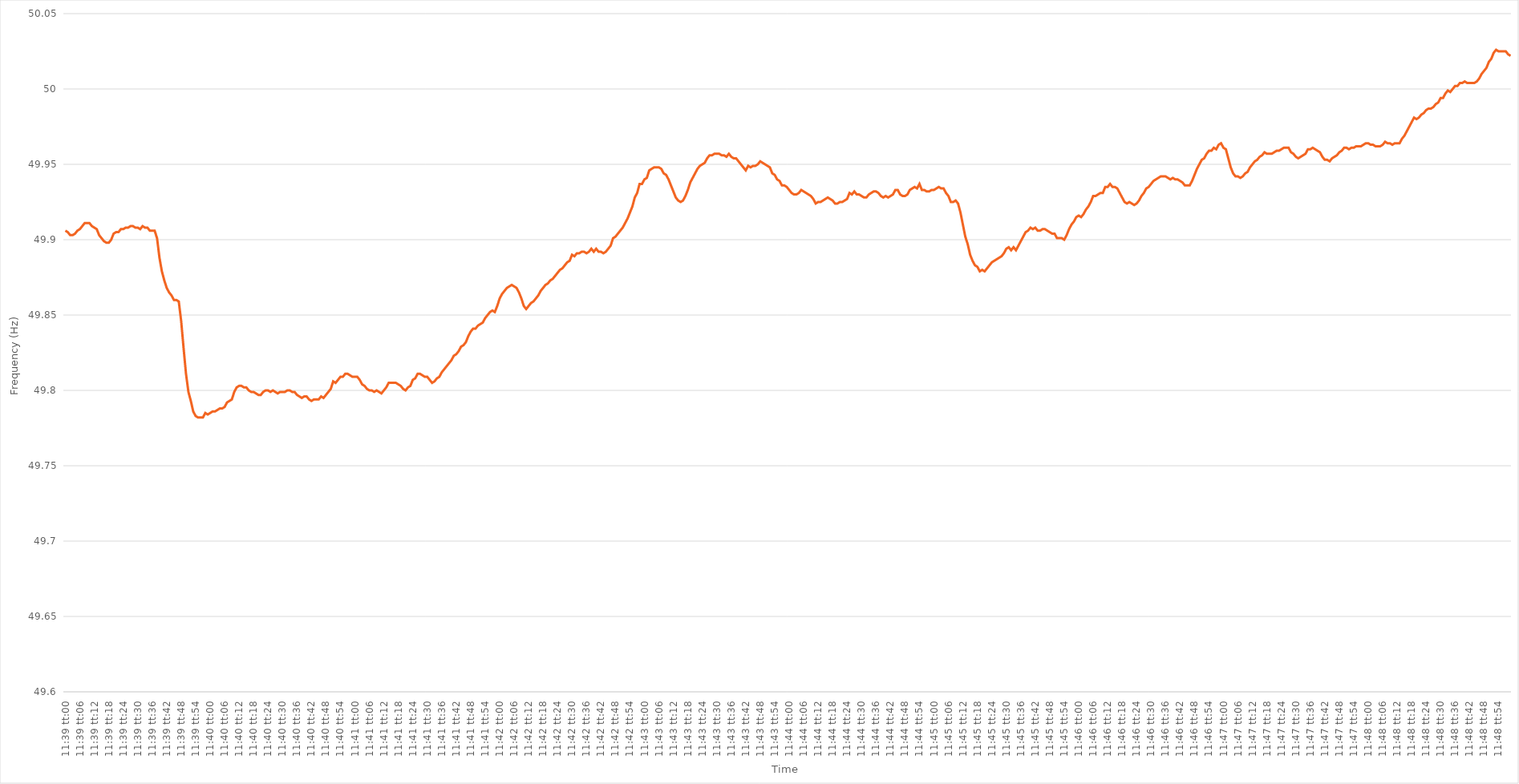
| Category | Series 0 |
|---|---|
| 0.48541666666666666 | 49.906 |
| 0.4854282407407407 | 49.905 |
| 0.48543981481481485 | 49.903 |
| 0.4854513888888889 | 49.903 |
| 0.485462962962963 | 49.904 |
| 0.485474537037037 | 49.906 |
| 0.4854861111111111 | 49.907 |
| 0.48549768518518516 | 49.909 |
| 0.4855092592592593 | 49.911 |
| 0.48552083333333335 | 49.911 |
| 0.48553240740740744 | 49.911 |
| 0.4855439814814815 | 49.909 |
| 0.4855555555555556 | 49.908 |
| 0.4855671296296296 | 49.907 |
| 0.48557870370370365 | 49.903 |
| 0.4855902777777778 | 49.901 |
| 0.48560185185185184 | 49.899 |
| 0.48561342592592593 | 49.898 |
| 0.485625 | 49.898 |
| 0.48563657407407407 | 49.9 |
| 0.4856481481481481 | 49.904 |
| 0.48565972222222226 | 49.905 |
| 0.4856712962962963 | 49.905 |
| 0.4856828703703704 | 49.907 |
| 0.48569444444444443 | 49.907 |
| 0.4857060185185185 | 49.908 |
| 0.48571759259259256 | 49.908 |
| 0.4857291666666667 | 49.909 |
| 0.48574074074074075 | 49.909 |
| 0.48575231481481485 | 49.908 |
| 0.4857638888888889 | 49.908 |
| 0.485775462962963 | 49.907 |
| 0.485787037037037 | 49.909 |
| 0.48579861111111106 | 49.908 |
| 0.4858101851851852 | 49.908 |
| 0.48582175925925924 | 49.906 |
| 0.48583333333333334 | 49.906 |
| 0.4858449074074074 | 49.906 |
| 0.4858564814814815 | 49.901 |
| 0.4858680555555555 | 49.888 |
| 0.48587962962962966 | 49.879 |
| 0.4858912037037037 | 49.873 |
| 0.4859027777777778 | 49.868 |
| 0.48591435185185183 | 49.865 |
| 0.48592592592592593 | 49.863 |
| 0.48593749999999997 | 49.86 |
| 0.4859490740740741 | 49.86 |
| 0.48596064814814816 | 49.859 |
| 0.48597222222222225 | 49.846 |
| 0.4859837962962963 | 49.828 |
| 0.4859953703703704 | 49.811 |
| 0.4860069444444444 | 49.799 |
| 0.48601851851851857 | 49.793 |
| 0.4860300925925926 | 49.786 |
| 0.48604166666666665 | 49.783 |
| 0.48605324074074074 | 49.782 |
| 0.4860648148148148 | 49.782 |
| 0.4860763888888889 | 49.782 |
| 0.4860879629629629 | 49.785 |
| 0.48609953703703707 | 49.784 |
| 0.4861111111111111 | 49.785 |
| 0.4861226851851852 | 49.786 |
| 0.48613425925925924 | 49.786 |
| 0.48614583333333333 | 49.787 |
| 0.48615740740740737 | 49.788 |
| 0.4861689814814815 | 49.788 |
| 0.48618055555555556 | 49.789 |
| 0.48619212962962965 | 49.792 |
| 0.4862037037037037 | 49.793 |
| 0.4862152777777778 | 49.794 |
| 0.4862268518518518 | 49.799 |
| 0.486238425925926 | 49.802 |
| 0.48625 | 49.803 |
| 0.4862615740740741 | 49.803 |
| 0.48627314814814815 | 49.802 |
| 0.4862847222222222 | 49.802 |
| 0.4862962962962963 | 49.8 |
| 0.4863078703703703 | 49.799 |
| 0.48631944444444447 | 49.799 |
| 0.4863310185185185 | 49.798 |
| 0.4863425925925926 | 49.797 |
| 0.48635416666666664 | 49.797 |
| 0.48636574074074074 | 49.799 |
| 0.4863773148148148 | 49.8 |
| 0.4863888888888889 | 49.8 |
| 0.48640046296296297 | 49.799 |
| 0.48641203703703706 | 49.8 |
| 0.4864236111111111 | 49.799 |
| 0.4864351851851852 | 49.798 |
| 0.48644675925925923 | 49.799 |
| 0.4864583333333334 | 49.799 |
| 0.4864699074074074 | 49.799 |
| 0.4864814814814815 | 49.8 |
| 0.48649305555555555 | 49.8 |
| 0.48650462962962965 | 49.799 |
| 0.4865162037037037 | 49.799 |
| 0.4865277777777777 | 49.797 |
| 0.4865393518518519 | 49.796 |
| 0.4865509259259259 | 49.795 |
| 0.4865625 | 49.796 |
| 0.48657407407407405 | 49.796 |
| 0.48658564814814814 | 49.794 |
| 0.4865972222222222 | 49.793 |
| 0.48660879629629633 | 49.794 |
| 0.48662037037037037 | 49.794 |
| 0.48663194444444446 | 49.794 |
| 0.4866435185185185 | 49.796 |
| 0.4866550925925926 | 49.795 |
| 0.48666666666666664 | 49.797 |
| 0.4866782407407408 | 49.799 |
| 0.4866898148148148 | 49.801 |
| 0.4867013888888889 | 49.806 |
| 0.48671296296296296 | 49.805 |
| 0.48672453703703705 | 49.807 |
| 0.4867361111111111 | 49.809 |
| 0.48674768518518513 | 49.809 |
| 0.4867592592592593 | 49.811 |
| 0.4867708333333333 | 49.811 |
| 0.4867824074074074 | 49.81 |
| 0.48679398148148145 | 49.809 |
| 0.48680555555555555 | 49.809 |
| 0.4868171296296296 | 49.809 |
| 0.48682870370370374 | 49.807 |
| 0.4868402777777778 | 49.804 |
| 0.48685185185185187 | 49.803 |
| 0.4868634259259259 | 49.801 |
| 0.486875 | 49.8 |
| 0.48688657407407404 | 49.8 |
| 0.4868981481481482 | 49.799 |
| 0.48690972222222223 | 49.8 |
| 0.4869212962962963 | 49.799 |
| 0.48693287037037036 | 49.798 |
| 0.48694444444444446 | 49.8 |
| 0.4869560185185185 | 49.802 |
| 0.48696759259259265 | 49.805 |
| 0.4869791666666667 | 49.805 |
| 0.4869907407407407 | 49.805 |
| 0.4870023148148148 | 49.805 |
| 0.48701388888888886 | 49.804 |
| 0.48702546296296295 | 49.803 |
| 0.487037037037037 | 49.801 |
| 0.48704861111111114 | 49.8 |
| 0.4870601851851852 | 49.802 |
| 0.4870717592592593 | 49.803 |
| 0.4870833333333333 | 49.807 |
| 0.4870949074074074 | 49.808 |
| 0.48710648148148145 | 49.811 |
| 0.4871180555555556 | 49.811 |
| 0.48712962962962963 | 49.81 |
| 0.48714120370370373 | 49.809 |
| 0.48715277777777777 | 49.809 |
| 0.48716435185185186 | 49.807 |
| 0.4871759259259259 | 49.805 |
| 0.48718750000000005 | 49.806 |
| 0.4871990740740741 | 49.808 |
| 0.4872106481481482 | 49.809 |
| 0.4872222222222222 | 49.812 |
| 0.48723379629629626 | 49.814 |
| 0.48724537037037036 | 49.816 |
| 0.4872569444444444 | 49.818 |
| 0.48726851851851855 | 49.82 |
| 0.4872800925925926 | 49.823 |
| 0.4872916666666667 | 49.824 |
| 0.4873032407407407 | 49.826 |
| 0.4873148148148148 | 49.829 |
| 0.48732638888888885 | 49.83 |
| 0.487337962962963 | 49.832 |
| 0.48734953703703704 | 49.836 |
| 0.48736111111111113 | 49.839 |
| 0.4873726851851852 | 49.841 |
| 0.48738425925925927 | 49.841 |
| 0.4873958333333333 | 49.843 |
| 0.48740740740740746 | 49.844 |
| 0.4874189814814815 | 49.845 |
| 0.4874305555555556 | 49.848 |
| 0.48744212962962963 | 49.85 |
| 0.48745370370370367 | 49.852 |
| 0.48746527777777776 | 49.853 |
| 0.4874768518518518 | 49.852 |
| 0.48748842592592595 | 49.856 |
| 0.4875 | 49.861 |
| 0.4875115740740741 | 49.864 |
| 0.4875231481481481 | 49.866 |
| 0.4875347222222222 | 49.868 |
| 0.48754629629629626 | 49.869 |
| 0.4875578703703704 | 49.87 |
| 0.48756944444444444 | 49.869 |
| 0.48758101851851854 | 49.868 |
| 0.4875925925925926 | 49.865 |
| 0.48760416666666667 | 49.861 |
| 0.4876157407407407 | 49.856 |
| 0.48762731481481486 | 49.854 |
| 0.4876388888888889 | 49.856 |
| 0.487650462962963 | 49.858 |
| 0.48766203703703703 | 49.859 |
| 0.4876736111111111 | 49.861 |
| 0.48768518518518517 | 49.863 |
| 0.4876967592592592 | 49.866 |
| 0.48770833333333335 | 49.868 |
| 0.4877199074074074 | 49.87 |
| 0.4877314814814815 | 49.871 |
| 0.4877430555555555 | 49.873 |
| 0.4877546296296296 | 49.874 |
| 0.48776620370370366 | 49.876 |
| 0.4877777777777778 | 49.878 |
| 0.48778935185185185 | 49.88 |
| 0.48780092592592594 | 49.881 |
| 0.4878125 | 49.883 |
| 0.4878240740740741 | 49.885 |
| 0.4878356481481481 | 49.886 |
| 0.48784722222222227 | 49.89 |
| 0.4878587962962963 | 49.889 |
| 0.4878703703703704 | 49.891 |
| 0.48788194444444444 | 49.891 |
| 0.48789351851851853 | 49.892 |
| 0.48790509259259257 | 49.892 |
| 0.4879166666666667 | 49.891 |
| 0.48792824074074076 | 49.892 |
| 0.4879398148148148 | 49.894 |
| 0.4879513888888889 | 49.892 |
| 0.48796296296296293 | 49.894 |
| 0.487974537037037 | 49.892 |
| 0.48798611111111106 | 49.892 |
| 0.4879976851851852 | 49.891 |
| 0.48800925925925925 | 49.892 |
| 0.48802083333333335 | 49.894 |
| 0.4880324074074074 | 49.896 |
| 0.4880439814814815 | 49.901 |
| 0.4880555555555555 | 49.902 |
| 0.48806712962962967 | 49.904 |
| 0.4880787037037037 | 49.906 |
| 0.4880902777777778 | 49.908 |
| 0.48810185185185184 | 49.911 |
| 0.48811342592592594 | 49.914 |
| 0.488125 | 49.918 |
| 0.4881365740740741 | 49.922 |
| 0.48814814814814816 | 49.928 |
| 0.48815972222222226 | 49.931 |
| 0.4881712962962963 | 49.937 |
| 0.48818287037037034 | 49.937 |
| 0.48819444444444443 | 49.94 |
| 0.48820601851851847 | 49.941 |
| 0.4882175925925926 | 49.946 |
| 0.48822916666666666 | 49.947 |
| 0.48824074074074075 | 49.948 |
| 0.4882523148148148 | 49.948 |
| 0.4882638888888889 | 49.948 |
| 0.4882754629629629 | 49.947 |
| 0.4882870370370371 | 49.944 |
| 0.4882986111111111 | 49.943 |
| 0.4883101851851852 | 49.94 |
| 0.48832175925925925 | 49.936 |
| 0.48833333333333334 | 49.932 |
| 0.4883449074074074 | 49.928 |
| 0.48835648148148153 | 49.926 |
| 0.48836805555555557 | 49.925 |
| 0.48837962962962966 | 49.926 |
| 0.4883912037037037 | 49.929 |
| 0.48840277777777774 | 49.933 |
| 0.48841435185185184 | 49.938 |
| 0.4884259259259259 | 49.941 |
| 0.4884375 | 49.944 |
| 0.48844907407407406 | 49.947 |
| 0.48846064814814816 | 49.949 |
| 0.4884722222222222 | 49.95 |
| 0.4884837962962963 | 49.951 |
| 0.48849537037037033 | 49.954 |
| 0.4885069444444445 | 49.956 |
| 0.4885185185185185 | 49.956 |
| 0.4885300925925926 | 49.957 |
| 0.48854166666666665 | 49.957 |
| 0.48855324074074075 | 49.957 |
| 0.4885648148148148 | 49.956 |
| 0.48857638888888894 | 49.956 |
| 0.488587962962963 | 49.955 |
| 0.48859953703703707 | 49.957 |
| 0.4886111111111111 | 49.955 |
| 0.4886226851851852 | 49.954 |
| 0.48863425925925924 | 49.954 |
| 0.4886458333333333 | 49.952 |
| 0.48865740740740743 | 49.95 |
| 0.48866898148148147 | 49.948 |
| 0.48868055555555556 | 49.946 |
| 0.4886921296296296 | 49.949 |
| 0.4887037037037037 | 49.948 |
| 0.48871527777777773 | 49.949 |
| 0.4887268518518519 | 49.949 |
| 0.4887384259259259 | 49.95 |
| 0.48875 | 49.952 |
| 0.48876157407407406 | 49.951 |
| 0.48877314814814815 | 49.95 |
| 0.4887847222222222 | 49.949 |
| 0.48879629629629634 | 49.948 |
| 0.4888078703703704 | 49.944 |
| 0.4888194444444445 | 49.943 |
| 0.4888310185185185 | 49.94 |
| 0.4888425925925926 | 49.939 |
| 0.48885416666666665 | 49.936 |
| 0.4888657407407408 | 49.936 |
| 0.48887731481481483 | 49.935 |
| 0.4888888888888889 | 49.933 |
| 0.48890046296296297 | 49.931 |
| 0.488912037037037 | 49.93 |
| 0.4889236111111111 | 49.93 |
| 0.48893518518518514 | 49.931 |
| 0.4889467592592593 | 49.933 |
| 0.48895833333333333 | 49.932 |
| 0.4889699074074074 | 49.931 |
| 0.48898148148148146 | 49.93 |
| 0.48899305555555556 | 49.929 |
| 0.4890046296296296 | 49.927 |
| 0.48901620370370374 | 49.924 |
| 0.4890277777777778 | 49.925 |
| 0.4890393518518519 | 49.925 |
| 0.4890509259259259 | 49.926 |
| 0.4890625 | 49.927 |
| 0.48907407407407405 | 49.928 |
| 0.4890856481481482 | 49.927 |
| 0.48909722222222224 | 49.926 |
| 0.48910879629629633 | 49.924 |
| 0.48912037037037037 | 49.924 |
| 0.4891319444444444 | 49.925 |
| 0.4891435185185185 | 49.925 |
| 0.48915509259259254 | 49.926 |
| 0.4891666666666667 | 49.927 |
| 0.48917824074074073 | 49.931 |
| 0.4891898148148148 | 49.93 |
| 0.48920138888888887 | 49.932 |
| 0.48921296296296296 | 49.93 |
| 0.489224537037037 | 49.93 |
| 0.48923611111111115 | 49.929 |
| 0.4892476851851852 | 49.928 |
| 0.4892592592592593 | 49.928 |
| 0.4892708333333333 | 49.93 |
| 0.4892824074074074 | 49.931 |
| 0.48929398148148145 | 49.932 |
| 0.4893055555555556 | 49.932 |
| 0.48931712962962964 | 49.931 |
| 0.48932870370370374 | 49.929 |
| 0.4893402777777778 | 49.928 |
| 0.4893518518518518 | 49.929 |
| 0.4893634259259259 | 49.928 |
| 0.48937499999999995 | 49.929 |
| 0.4893865740740741 | 49.93 |
| 0.48939814814814814 | 49.933 |
| 0.48940972222222223 | 49.933 |
| 0.48942129629629627 | 49.93 |
| 0.48943287037037037 | 49.929 |
| 0.4894444444444444 | 49.929 |
| 0.48945601851851855 | 49.93 |
| 0.4894675925925926 | 49.933 |
| 0.4894791666666667 | 49.934 |
| 0.4894907407407407 | 49.935 |
| 0.4895023148148148 | 49.934 |
| 0.48951388888888886 | 49.937 |
| 0.489525462962963 | 49.933 |
| 0.48953703703703705 | 49.933 |
| 0.48954861111111114 | 49.932 |
| 0.4895601851851852 | 49.932 |
| 0.4895717592592593 | 49.933 |
| 0.4895833333333333 | 49.933 |
| 0.48959490740740735 | 49.934 |
| 0.4896064814814815 | 49.935 |
| 0.48961805555555554 | 49.934 |
| 0.48962962962962964 | 49.934 |
| 0.4896412037037037 | 49.931 |
| 0.48965277777777777 | 49.929 |
| 0.4896643518518518 | 49.925 |
| 0.48967592592592596 | 49.925 |
| 0.4896875 | 49.926 |
| 0.4896990740740741 | 49.924 |
| 0.48971064814814813 | 49.918 |
| 0.4897222222222222 | 49.91 |
| 0.48973379629629626 | 49.902 |
| 0.4897453703703704 | 49.897 |
| 0.48975694444444445 | 49.89 |
| 0.48976851851851855 | 49.886 |
| 0.4897800925925926 | 49.883 |
| 0.4897916666666667 | 49.882 |
| 0.4898032407407407 | 49.879 |
| 0.48981481481481487 | 49.88 |
| 0.4898263888888889 | 49.879 |
| 0.48983796296296295 | 49.881 |
| 0.48984953703703704 | 49.883 |
| 0.4898611111111111 | 49.885 |
| 0.4898726851851852 | 49.886 |
| 0.4898842592592592 | 49.887 |
| 0.48989583333333336 | 49.888 |
| 0.4899074074074074 | 49.889 |
| 0.4899189814814815 | 49.891 |
| 0.48993055555555554 | 49.894 |
| 0.48994212962962963 | 49.895 |
| 0.48995370370370367 | 49.893 |
| 0.4899652777777778 | 49.895 |
| 0.48997685185185186 | 49.893 |
| 0.48998842592592595 | 49.896 |
| 0.49 | 49.899 |
| 0.4900115740740741 | 49.902 |
| 0.4900231481481481 | 49.905 |
| 0.4900347222222223 | 49.906 |
| 0.4900462962962963 | 49.908 |
| 0.49005787037037035 | 49.907 |
| 0.49006944444444445 | 49.908 |
| 0.4900810185185185 | 49.906 |
| 0.4900925925925926 | 49.906 |
| 0.4901041666666666 | 49.907 |
| 0.49011574074074077 | 49.907 |
| 0.4901273148148148 | 49.906 |
| 0.4901388888888889 | 49.905 |
| 0.49015046296296294 | 49.904 |
| 0.49016203703703703 | 49.904 |
| 0.4901736111111111 | 49.901 |
| 0.4901851851851852 | 49.901 |
| 0.49019675925925926 | 49.901 |
| 0.49020833333333336 | 49.9 |
| 0.4902199074074074 | 49.903 |
| 0.4902314814814815 | 49.907 |
| 0.49024305555555553 | 49.91 |
| 0.4902546296296297 | 49.912 |
| 0.4902662037037037 | 49.915 |
| 0.4902777777777778 | 49.916 |
| 0.49028935185185185 | 49.915 |
| 0.4903009259259259 | 49.917 |
| 0.4903125 | 49.92 |
| 0.490324074074074 | 49.922 |
| 0.4903356481481482 | 49.925 |
| 0.4903472222222222 | 49.929 |
| 0.4903587962962963 | 49.929 |
| 0.49037037037037035 | 49.93 |
| 0.49038194444444444 | 49.931 |
| 0.4903935185185185 | 49.931 |
| 0.49040509259259263 | 49.935 |
| 0.49041666666666667 | 49.935 |
| 0.49042824074074076 | 49.937 |
| 0.4904398148148148 | 49.935 |
| 0.4904513888888889 | 49.935 |
| 0.49046296296296293 | 49.934 |
| 0.4904745370370371 | 49.931 |
| 0.4904861111111111 | 49.928 |
| 0.4904976851851852 | 49.925 |
| 0.49050925925925926 | 49.924 |
| 0.49052083333333335 | 49.925 |
| 0.4905324074074074 | 49.924 |
| 0.49054398148148143 | 49.923 |
| 0.4905555555555556 | 49.924 |
| 0.4905671296296296 | 49.926 |
| 0.4905787037037037 | 49.929 |
| 0.49059027777777775 | 49.931 |
| 0.49060185185185184 | 49.934 |
| 0.4906134259259259 | 49.935 |
| 0.49062500000000003 | 49.937 |
| 0.49063657407407407 | 49.939 |
| 0.49064814814814817 | 49.94 |
| 0.4906597222222222 | 49.941 |
| 0.4906712962962963 | 49.942 |
| 0.49068287037037034 | 49.942 |
| 0.4906944444444445 | 49.942 |
| 0.4907060185185185 | 49.941 |
| 0.4907175925925926 | 49.94 |
| 0.49072916666666666 | 49.941 |
| 0.49074074074074076 | 49.94 |
| 0.4907523148148148 | 49.94 |
| 0.49076388888888894 | 49.939 |
| 0.490775462962963 | 49.938 |
| 0.490787037037037 | 49.936 |
| 0.4907986111111111 | 49.936 |
| 0.49081018518518515 | 49.936 |
| 0.49082175925925925 | 49.939 |
| 0.4908333333333333 | 49.943 |
| 0.49084490740740744 | 49.947 |
| 0.4908564814814815 | 49.95 |
| 0.49086805555555557 | 49.953 |
| 0.4908796296296296 | 49.954 |
| 0.4908912037037037 | 49.957 |
| 0.49090277777777774 | 49.959 |
| 0.4909143518518519 | 49.959 |
| 0.49092592592592593 | 49.961 |
| 0.4909375 | 49.96 |
| 0.49094907407407407 | 49.963 |
| 0.49096064814814816 | 49.964 |
| 0.4909722222222222 | 49.961 |
| 0.49098379629629635 | 49.96 |
| 0.4909953703703704 | 49.954 |
| 0.4910069444444444 | 49.948 |
| 0.4910185185185185 | 49.944 |
| 0.49103009259259256 | 49.942 |
| 0.49104166666666665 | 49.942 |
| 0.4910532407407407 | 49.941 |
| 0.49106481481481484 | 49.942 |
| 0.4910763888888889 | 49.944 |
| 0.491087962962963 | 49.945 |
| 0.491099537037037 | 49.948 |
| 0.4911111111111111 | 49.95 |
| 0.49112268518518515 | 49.952 |
| 0.4911342592592593 | 49.953 |
| 0.49114583333333334 | 49.955 |
| 0.49115740740740743 | 49.956 |
| 0.49116898148148147 | 49.958 |
| 0.49118055555555556 | 49.957 |
| 0.4911921296296296 | 49.957 |
| 0.49120370370370375 | 49.957 |
| 0.4912152777777778 | 49.958 |
| 0.4912268518518519 | 49.959 |
| 0.4912384259259259 | 49.959 |
| 0.49124999999999996 | 49.96 |
| 0.49126157407407406 | 49.961 |
| 0.4912731481481481 | 49.961 |
| 0.49128472222222225 | 49.961 |
| 0.4912962962962963 | 49.958 |
| 0.4913078703703704 | 49.957 |
| 0.4913194444444444 | 49.955 |
| 0.4913310185185185 | 49.954 |
| 0.49134259259259255 | 49.955 |
| 0.4913541666666667 | 49.956 |
| 0.49136574074074074 | 49.957 |
| 0.49137731481481484 | 49.96 |
| 0.4913888888888889 | 49.96 |
| 0.49140046296296297 | 49.961 |
| 0.491412037037037 | 49.96 |
| 0.49142361111111116 | 49.959 |
| 0.4914351851851852 | 49.958 |
| 0.4914467592592593 | 49.955 |
| 0.49145833333333333 | 49.953 |
| 0.4914699074074074 | 49.953 |
| 0.49148148148148146 | 49.952 |
| 0.4914930555555555 | 49.954 |
| 0.49150462962962965 | 49.955 |
| 0.4915162037037037 | 49.956 |
| 0.4915277777777778 | 49.958 |
| 0.4915393518518518 | 49.959 |
| 0.4915509259259259 | 49.961 |
| 0.49156249999999996 | 49.961 |
| 0.4915740740740741 | 49.96 |
| 0.49158564814814815 | 49.961 |
| 0.49159722222222224 | 49.961 |
| 0.4916087962962963 | 49.962 |
| 0.4916203703703704 | 49.962 |
| 0.4916319444444444 | 49.962 |
| 0.49164351851851856 | 49.963 |
| 0.4916550925925926 | 49.964 |
| 0.4916666666666667 | 49.964 |
| 0.49167824074074074 | 49.963 |
| 0.49168981481481483 | 49.963 |
| 0.49170138888888887 | 49.962 |
| 0.491712962962963 | 49.962 |
| 0.49172453703703706 | 49.962 |
| 0.4917361111111111 | 49.963 |
| 0.4917476851851852 | 49.965 |
| 0.49175925925925923 | 49.964 |
| 0.4917708333333333 | 49.964 |
| 0.49178240740740736 | 49.963 |
| 0.4917939814814815 | 49.964 |
| 0.49180555555555555 | 49.964 |
| 0.49181712962962965 | 49.964 |
| 0.4918287037037037 | 49.967 |
| 0.4918402777777778 | 49.969 |
| 0.4918518518518518 | 49.972 |
| 0.49186342592592597 | 49.975 |
| 0.491875 | 49.978 |
| 0.4918865740740741 | 49.981 |
| 0.49189814814814814 | 49.98 |
| 0.49190972222222223 | 49.981 |
| 0.4919212962962963 | 49.983 |
| 0.4919328703703704 | 49.984 |
| 0.49194444444444446 | 49.986 |
| 0.4919560185185185 | 49.987 |
| 0.4919675925925926 | 49.987 |
| 0.49197916666666663 | 49.988 |
| 0.49199074074074073 | 49.99 |
| 0.49200231481481477 | 49.991 |
| 0.4920138888888889 | 49.994 |
| 0.49202546296296296 | 49.994 |
| 0.49203703703703705 | 49.997 |
| 0.4920486111111111 | 49.999 |
| 0.4920601851851852 | 49.998 |
| 0.4920717592592592 | 50 |
| 0.4920833333333334 | 50.002 |
| 0.4920949074074074 | 50.002 |
| 0.4921064814814815 | 50.004 |
| 0.49211805555555554 | 50.004 |
| 0.49212962962962964 | 50.005 |
| 0.4921412037037037 | 50.004 |
| 0.49215277777777783 | 50.004 |
| 0.49216435185185187 | 50.004 |
| 0.49217592592592596 | 50.004 |
| 0.4921875 | 50.005 |
| 0.49219907407407404 | 50.007 |
| 0.49221064814814813 | 50.01 |
| 0.49222222222222217 | 50.012 |
| 0.4922337962962963 | 50.014 |
| 0.49224537037037036 | 50.018 |
| 0.49225694444444446 | 50.02 |
| 0.4922685185185185 | 50.024 |
| 0.4922800925925926 | 50.026 |
| 0.4922916666666666 | 50.025 |
| 0.4923032407407408 | 50.025 |
| 0.4923148148148148 | 50.025 |
| 0.4923263888888889 | 50.025 |
| 0.49233796296296295 | 50.023 |
| 0.49234953703703704 | 50.022 |